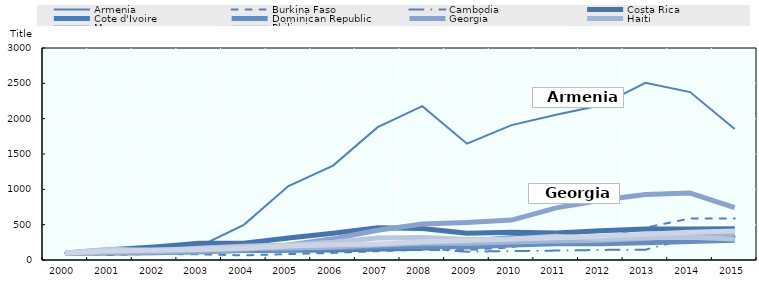
| Category | Armenia | Burkina Faso | Cambodia | Costa Rica | Cote d'Ivoire | Dominican Republic | Georgia | Haiti | Morocco | Philippines |
|---|---|---|---|---|---|---|---|---|---|---|
| 2000.0 | 100 | 100 | 100 | 100 | 100 | 100 | 100 | 100 | 100 | 100 |
| 2001.0 | 107.909 | 74.13 | 109.936 | 146.373 | 97.479 | 107.826 | 105.739 | 107.958 | 150.922 | 126.046 |
| 2002.0 | 149.963 | 87.227 | 115.867 | 184.666 | 100.844 | 119.293 | 110.15 | 116.955 | 133.33 | 140.003 |
| 2003.0 | 191.881 | 79.821 | 114.717 | 236.673 | 119.328 | 126.359 | 112.606 | 140.311 | 167.125 | 147.247 |
| 2004.0 | 497.024 | 65.965 | 147.187 | 235.504 | 133.621 | 135.924 | 144.56 | 161.246 | 195.365 | 164.913 |
| 2005.0 | 1046.337 | 84.12 | 135.82 | 310.009 | 137.121 | 147.783 | 212.842 | 170.615 | 212.459 | 197.392 |
| 2006.0 | 1336.656 | 100.892 | 152.414 | 378.458 | 140.136 | 165.967 | 299.383 | 183.887 | 252.372 | 215.442 |
| 2007.0 | 1879.93 | 125.231 | 154.156 | 455.722 | 155.204 | 184.62 | 421.416 | 211.434 | 311.588 | 227.866 |
| 2008.0 | 2176.823 | 147.531 | 155.914 | 446.023 | 167.157 | 195.951 | 508.249 | 236.982 | 319.172 | 259.647 |
| 2009.0 | 1646.061 | 142.552 | 117.993 | 378.41 | 264.772 | 185.582 | 530.487 | 237.984 | 290.229 | 274.223 |
| 2010.0 | 1908.468 | 178.725 | 126.563 | 391.388 | 313.847 | 211.25 | 564.997 | 254.984 | 297.332 | 295.571 |
| 2011.0 | 2056.276 | 327.881 | 133.119 | 383.667 | 333.28 | 230.473 | 738.39 | 268.402 | 335.932 | 315.11 |
| 2012.0 | 2189.304 | 311.862 | 142.795 | 414.733 | 308.493 | 231.636 | 844.733 | 278.949 | 301.284 | 335.665 |
| 2013.0 | 2506.224 | 457.981 | 145.984 | 439.85 | 323.251 | 243.777 | 928.328 | 308.131 | 318.589 | 364.652 |
| 2014.0 | 2376.379 | 587.778 | 312.586 | 438.026 | 323.251 | 261.435 | 947.985 | 342.047 | 320.501 | 392.018 |
| 2015.0 | 1854.287 | 587.778 | 329.736 | 443.436 | 323.251 | 279.843 | 741.847 | 379.855 | 297.137 | 409.411 |